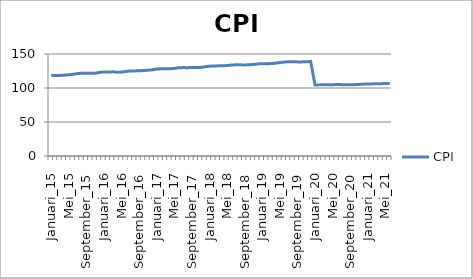
| Category | CPI |
|---|---|
| Januari_15 | 118.71 |
| Februari_15 | 118.28 |
| Maret_15 | 118.48 |
| Apri_15 | 118.91 |
| Mei_15 | 119.5 |
| Juni_15 | 120.14 |
| Juli_15 | 121.26 |
| Agustus_15 | 121.73 |
| September_15 | 121.67 |
| Oktober_15 | 121.57 |
| November_15 | 121.82 |
| Desember_15 | 122.99 |
| Januari_16 | 123.62 |
| Februari_16 | 123.51 |
| Maret_16 | 123.75 |
| April_16 | 123.19 |
| Mei_16 | 123.48 |
| Juni_16 | 124.29 |
| Juli_16 | 125.15 |
| Agustus_16 | 125.13 |
| September_16 | 125.41 |
| Oktober_16 | 125.59 |
| November_16 | 126.18 |
| Desember_16 | 126.71 |
| Januari_17 | 127.94 |
| Februari_17 | 128.24 |
| Maret_17 | 128.22 |
| April_17 | 128.33 |
| Mei_17 | 128.83 |
| Juni_17 | 129.72 |
| Juli_17 | 130 |
| Agustus_17 | 129.91 |
| September_17 | 130.08 |
| Oktober_17 | 130.09 |
| November_17 | 130.35 |
| Desember_17 | 131.28 |
| Januari_18 | 132.1 |
| Februari_18 | 132.32 |
| Maret_18 | 132.58 |
| April_18 | 132.71 |
| Mei_18 | 132.99 |
| Juni_18 | 133.77 |
| Juli_18 | 134.14 |
| Agustus_18 | 134.07 |
| September_18 | 133.83 |
| Oktober_18 | 134.2 |
| November_18 | 134.56 |
| Desember_18 | 135.39 |
| Januari_19 | 135.83 |
| Februari_19 | 135.72 |
| Maret_19 | 135.87 |
| April_19 | 136.47 |
| Mei_19 | 137.4 |
| Juni_19 | 138.16 |
| Juli_19 | 138.59 |
| Agustus_19 | 138.75 |
| September_19 | 138.37 |
| Oktober_19 | 138.4 |
| November_19 | 138.6 |
| Desember_19 | 139.07 |
| Januari_20 | 104.33 |
| Februari_20 | 104.62 |
| Maret_20 | 104.72 |
| April_20 | 104.8 |
| Mei_20 | 104.87 |
| Juni_20 | 105.06 |
| Juli_20 | 104.95 |
| Agustus_20 | 104.9 |
| September_20 | 104.85 |
| Oktober_20 | 104.92 |
| November_20 | 105.21 |
| Desember_20 | 105.68 |
| Januari_21 | 105.95 |
| Februari_21 | 106.06 |
| Maret_21 | 106.15 |
| April_21 | 106.29 |
| Mei_21 | 106.63 |
| Juni_21 | 106.46 |